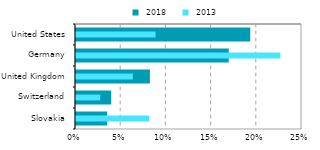
| Category |  2018 |
|---|---|
| Slovakia | 0.034 |
| Switzerland | 0.039 |
| United Kingdom | 0.082 |
| Germany | 0.169 |
| United States | 0.193 |